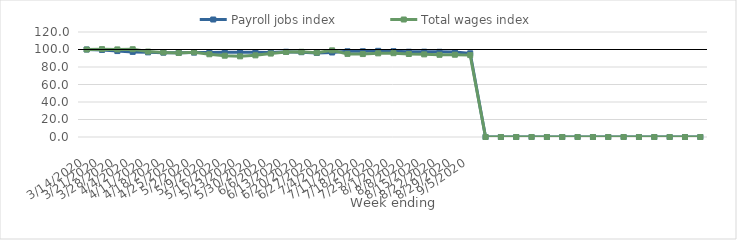
| Category | Payroll jobs index | Total wages index |
|---|---|---|
| 14/03/2020 | 100 | 100 |
| 21/03/2020 | 99.49 | 100.424 |
| 28/03/2020 | 98.203 | 100.097 |
| 04/04/2020 | 97.281 | 100.286 |
| 11/04/2020 | 96.747 | 97.614 |
| 18/04/2020 | 96.397 | 96.709 |
| 25/04/2020 | 96.311 | 96.027 |
| 02/05/2020 | 96.453 | 96.865 |
| 09/05/2020 | 96.578 | 94.568 |
| 16/05/2020 | 96.872 | 92.926 |
| 23/05/2020 | 96.852 | 92.196 |
| 30/05/2020 | 96.863 | 93.312 |
| 06/06/2020 | 96.7 | 95.341 |
| 13/06/2020 | 97.42 | 97.158 |
| 20/06/2020 | 96.919 | 97.356 |
| 27/06/2020 | 96.02 | 96.404 |
| 04/07/2020 | 96.584 | 99.006 |
| 11/07/2020 | 97.976 | 94.972 |
| 18/07/2020 | 97.982 | 94.778 |
| 25/07/2020 | 98.47 | 95.619 |
| 01/08/2020 | 98.043 | 95.77 |
| 08/08/2020 | 97.439 | 94.85 |
| 15/08/2020 | 97.506 | 94.444 |
| 22/08/2020 | 97.362 | 93.934 |
| 29/08/2020 | 97.126 | 94.023 |
| 05/09/2020 | 95.645 | 93.604 |